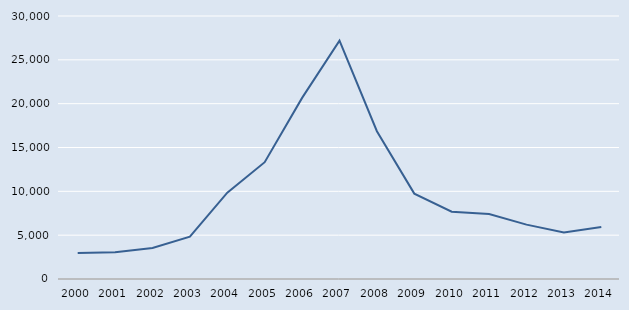
| Category | Series 0 |
|---|---|
| 2000.0 | 2968 |
| 2001.0 | 3057 |
| 2002.0 | 3538 |
| 2003.0 | 4825 |
| 2004.0 | 9851 |
| 2005.0 | 13327 |
| 2006.0 | 20658 |
| 2007.0 | 27178 |
| 2008.0 | 16857 |
| 2009.0 | 9739 |
| 2010.0 | 7678 |
| 2011.0 | 7424 |
| 2012.0 | 6201 |
| 2013.0 | 5302 |
| 2014.0 | 5923 |